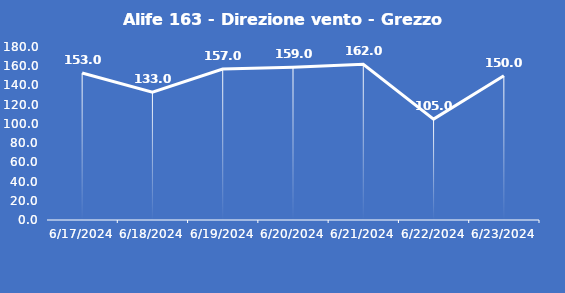
| Category | Alife 163 - Direzione vento - Grezzo (°N) |
|---|---|
| 6/17/24 | 153 |
| 6/18/24 | 133 |
| 6/19/24 | 157 |
| 6/20/24 | 159 |
| 6/21/24 | 162 |
| 6/22/24 | 105 |
| 6/23/24 | 150 |